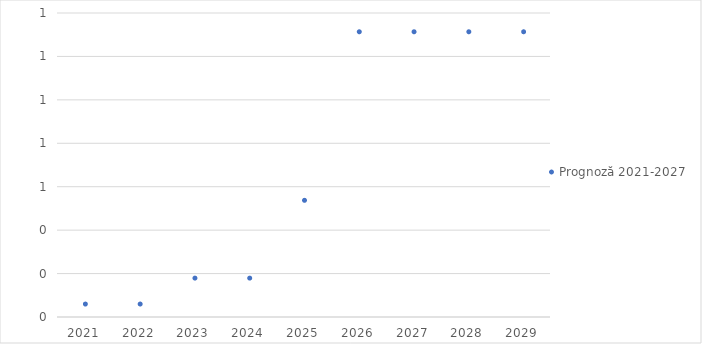
| Category | Prognoză 2021-2027 |
|---|---|
| 2021.0 | 0.06 |
| 2022.0 | 0.06 |
| 2023.0 | 0.179 |
| 2024.0 | 0.179 |
| 2025.0 | 0.537 |
| 2026.0 | 1.314 |
| 2027.0 | 1.314 |
| 2028.0 | 1.314 |
| 2029.0 | 1.314 |